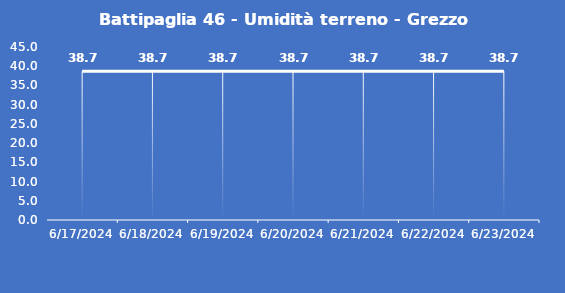
| Category | Battipaglia 46 - Umidità terreno - Grezzo (%VWC) |
|---|---|
| 6/17/24 | 38.7 |
| 6/18/24 | 38.7 |
| 6/19/24 | 38.7 |
| 6/20/24 | 38.7 |
| 6/21/24 | 38.7 |
| 6/22/24 | 38.7 |
| 6/23/24 | 38.7 |